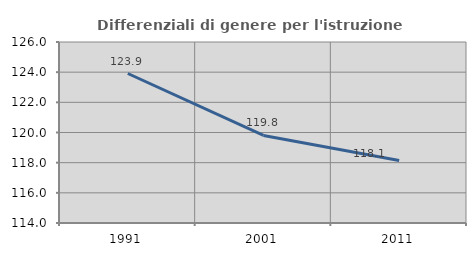
| Category | Differenziali di genere per l'istruzione superiore |
|---|---|
| 1991.0 | 123.911 |
| 2001.0 | 119.806 |
| 2011.0 | 118.139 |